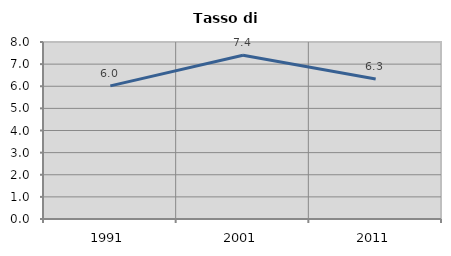
| Category | Tasso di disoccupazione   |
|---|---|
| 1991.0 | 6.016 |
| 2001.0 | 7.398 |
| 2011.0 | 6.325 |